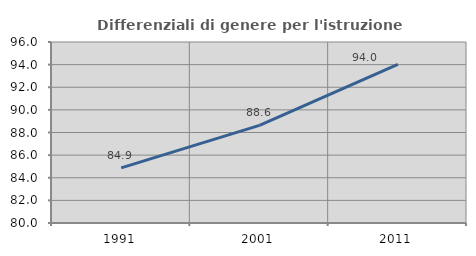
| Category | Differenziali di genere per l'istruzione superiore |
|---|---|
| 1991.0 | 84.869 |
| 2001.0 | 88.632 |
| 2011.0 | 94.033 |